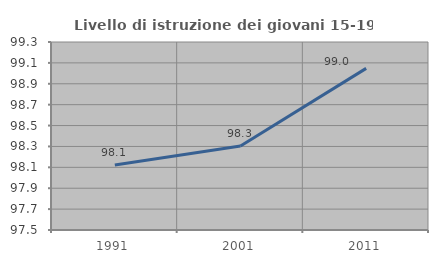
| Category | Livello di istruzione dei giovani 15-19 anni |
|---|---|
| 1991.0 | 98.122 |
| 2001.0 | 98.305 |
| 2011.0 | 99.048 |